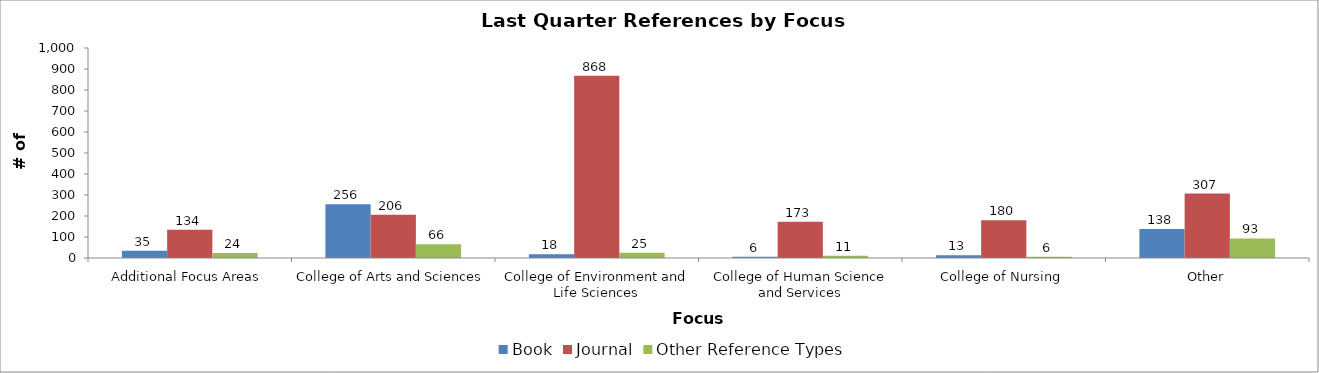
| Category | Book | Journal | Other Reference Types |
|---|---|---|---|
| Additional Focus Areas | 35 | 134 | 24 |
| College of Arts and Sciences | 256 | 206 | 66 |
| College of Environment and Life Sciences | 18 | 868 | 25 |
| College of Human Science and Services | 6 | 173 | 11 |
| College of Nursing | 13 | 180 | 6 |
| Other | 138 | 307 | 93 |